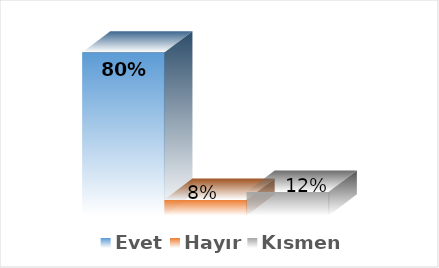
| Category | Evet | Hayır | Kısmen |
|---|---|---|---|
| 0 | 0.804 | 0.078 | 0.118 |